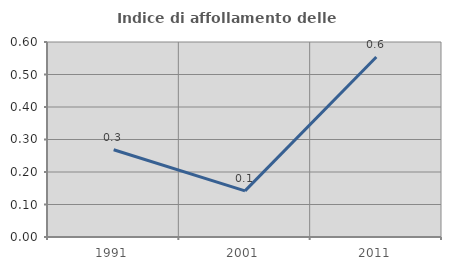
| Category | Indice di affollamento delle abitazioni  |
|---|---|
| 1991.0 | 0.268 |
| 2001.0 | 0.142 |
| 2011.0 | 0.554 |